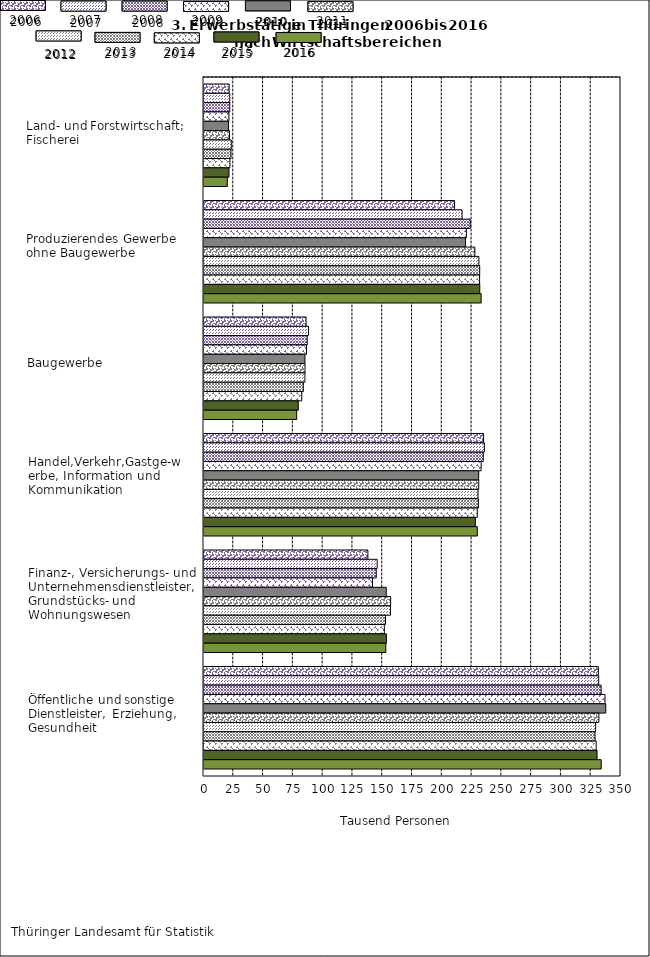
| Category | Series 0 | Series 1 | Series 2 | Series 3 | Series 4 | Series 5 | Series 6 | Series 7 | Series 8 | Series 9 | Series 10 |
|---|---|---|---|---|---|---|---|---|---|---|---|
| Land-und Forstwirtschaft; Fischerei | 21.088 | 21.642 | 21.625 | 20.929 | 20.592 | 21.36 | 22.882 | 22.674 | 21.743 | 20.958 | 19.552 |
| Produzierendes Gewerbe ohne Baugewerbe | 210.299 | 216.6 | 223.467 | 220.213 | 219.497 | 227.345 | 230.719 | 231.416 | 231.304 | 231.479 | 232.614 |
| Baugewerbe | 85.671 | 87.747 | 86.613 | 86.029 | 84.725 | 84.79 | 84.703 | 83.346 | 82.019 | 79.129 | 77.808 |
| Handel, Verkehr, Gastgewerbe, Information und Kommunikation | 234.634 | 235.323 | 234.402 | 232.603 | 230.531 | 230.58 | 229.969 | 230.327 | 229.372 | 227.766 | 229.424 |
| Finanz-, Versicherungs- und Unternehmensdienstl., Grundstücks- und Wohnungswesen | 137.545 | 145.353 | 144.585 | 141.437 | 152.98 | 156.647 | 156.496 | 152.333 | 151.362 | 153.124 | 152.613 |
| Öffentliche und sonstige Dienstleister, Erziehung, Gesundheit | 330.98 | 331.293 | 333.344 | 336.567 | 337.225 | 331.441 | 328.697 | 328.193 | 329.184 | 329.92 | 333.391 |